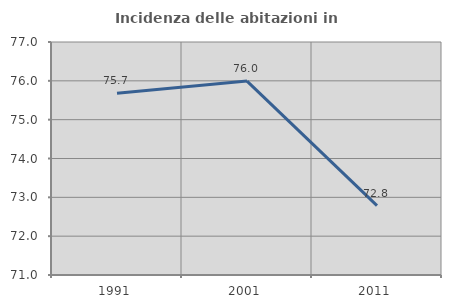
| Category | Incidenza delle abitazioni in proprietà  |
|---|---|
| 1991.0 | 75.68 |
| 2001.0 | 75.993 |
| 2011.0 | 72.785 |